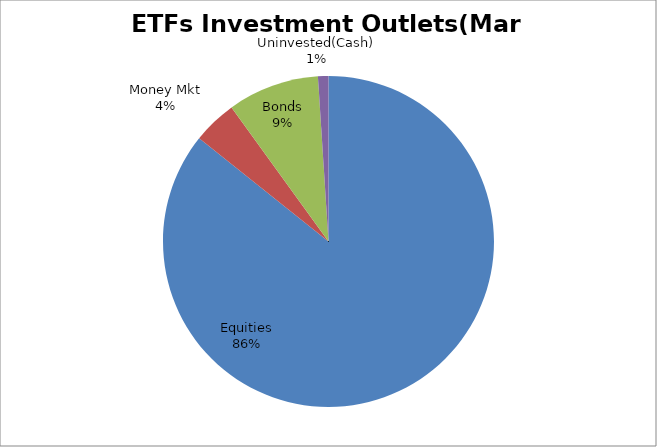
| Category | Series 0 |
|---|---|
| Equities | 4479173842.33 |
| Money Mkt | 225580048.82 |
| Bonds | 467336909.16 |
| Uninvested(Cash) | 53276506 |